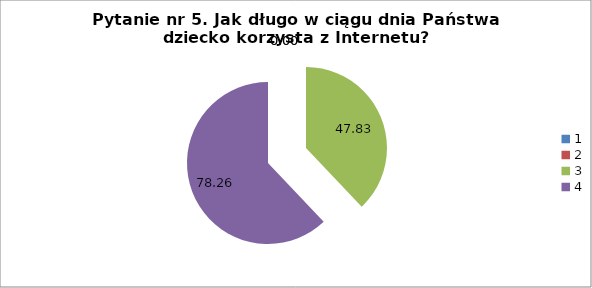
| Category | % |
|---|---|
| 0 | 0 |
| 1 | 0 |
| 2 | 47.826 |
| 3 | 78.261 |